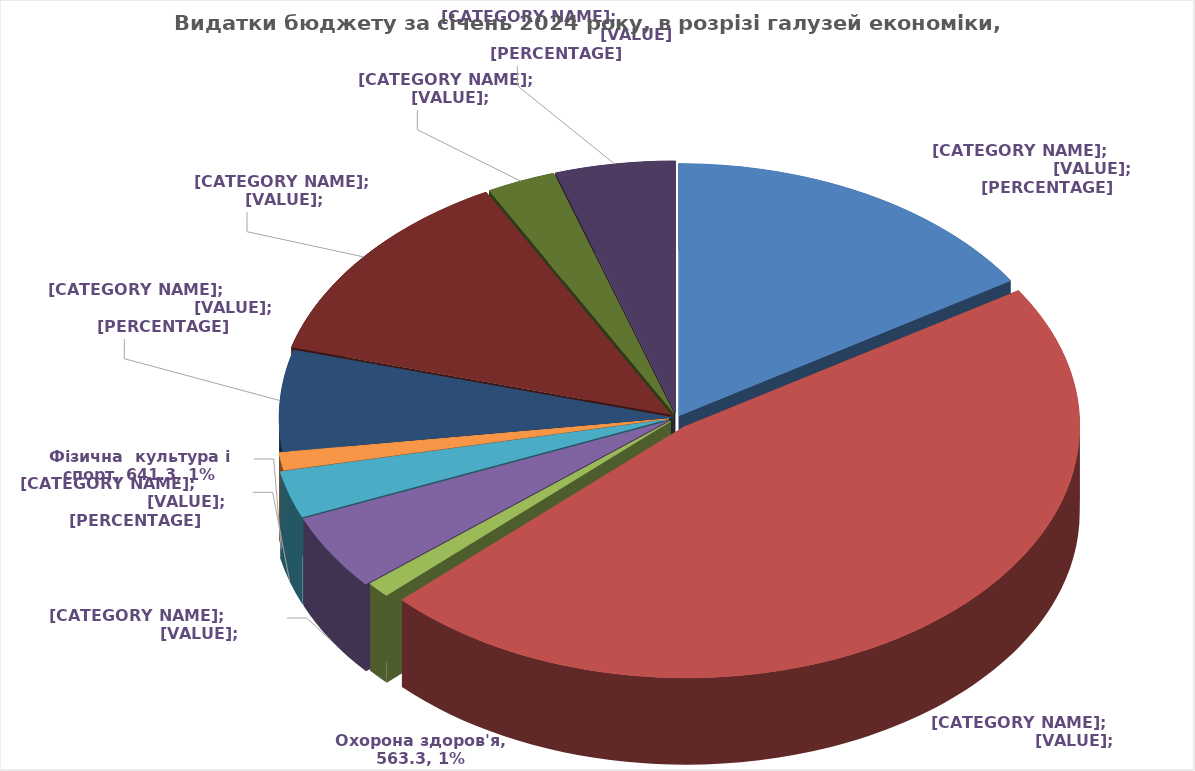
| Category | Видатки бюджету за січень 2024 року, в розрізі галузей економіки, тис. грн | % |
|---|---|---|
| Державне управління | 8962.202 | 15.981 |
| Освіта  | 26278.583 | 46.859 |
| Охорона здоров'я | 563.293 | 1.004 |
| Соціальний захист та соціальне забезпечення | 2719.861 | 4.85 |
| Культура і мистецтво | 1686.64 | 3.008 |
| Фізична  культура і спорт | 641.315 | 1.144 |
| Житлово-комунальне господарство | 3626.49 | 6.467 |
| Економічна діяльність | 7243.633 | 12.917 |
| Інша діяльність | 1590.144 | 2.836 |
| Підтримка військових формувань | 2767.593 | 4.935 |